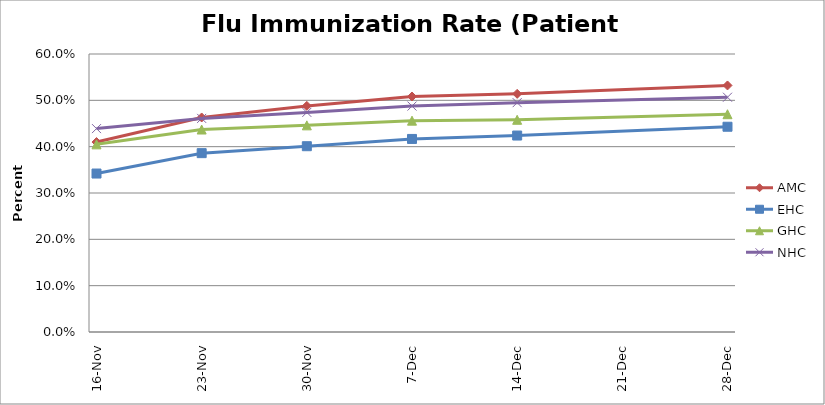
| Category | AMC | EHC | GHC | NHC |
|---|---|---|---|---|
| 2020-11-16 | 0.41 | 0.342 | 0.405 | 0.439 |
| 2020-11-23 | 0.463 | 0.386 | 0.437 | 0.461 |
| 2020-11-30 | 0.488 | 0.401 | 0.446 | 0.474 |
| 2020-12-07 | 0.508 | 0.417 | 0.456 | 0.488 |
| 2020-12-14 | 0.514 | 0.424 | 0.458 | 0.495 |
| 2020-12-28 | 0.532 | 0.443 | 0.47 | 0.507 |